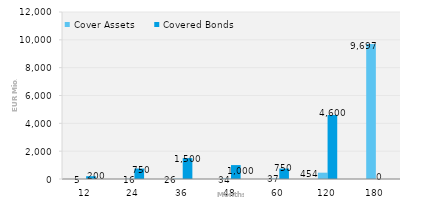
| Category | Cover Assets | Covered Bonds |
|---|---|---|
| 12.0 | 5.024 | 200 |
| 24.0 | 15.63 | 750 |
| 36.0 | 26.418 | 1500 |
| 48.0 | 34.331 | 1000 |
| 60.0 | 36.732 | 750 |
| 120.0 | 454.209 | 4600 |
| 180.0 | 9696.75 | 0 |